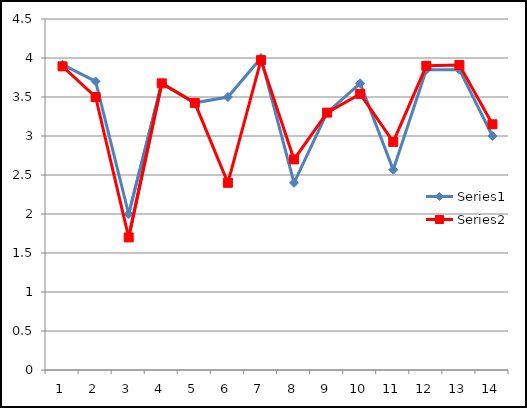
| Category | Series 0 | Series 1 |
|---|---|---|
| 0 | 3.914 | 3.893 |
| 1 | 3.7 | 3.5 |
| 2 | 2 | 1.7 |
| 3 | 3.675 | 3.675 |
| 4 | 3.425 | 3.425 |
| 5 | 3.5 | 2.4 |
| 6 | 4 | 3.973 |
| 7 | 2.4 | 2.7 |
| 8 | 3.3 | 3.3 |
| 9 | 3.675 | 3.54 |
| 10 | 2.567 | 2.925 |
| 11 | 3.85 | 3.9 |
| 12 | 3.85 | 3.91 |
| 13 | 3 | 3.15 |